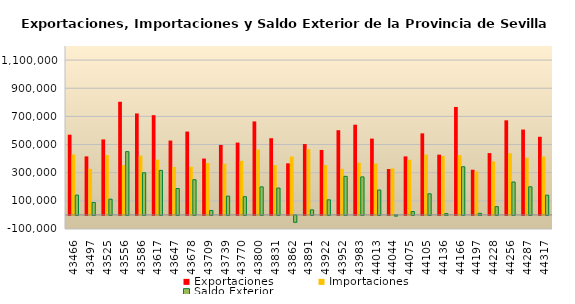
| Category | Exportaciones | Importaciones | Saldo Exterior |
|---|---|---|---|
| 2019-01-01 | 569931.277 | 429494.742 | 140436.534 |
| 2019-02-01 | 415835.783 | 327549.688 | 88286.094 |
| 2019-03-01 | 536289.213 | 424398.806 | 111890.407 |
| 2019-04-01 | 803799.832 | 354056.045 | 449743.787 |
| 2019-05-01 | 720786.65 | 421173.779 | 299612.871 |
| 2019-06-01 | 708636.402 | 392376.669 | 316259.734 |
| 2019-07-01 | 528188.273 | 340690.207 | 187498.067 |
| 2019-08-01 | 592019.511 | 341747.051 | 250272.46 |
| 2019-09-01 | 400434 | 368760 | 31674 |
| 2019-10-01 | 497188.203 | 363534.861 | 133653.342 |
| 2019-11-01 | 513902.151 | 384307.903 | 129594.248 |
| 2019-12-01 | 664224.395 | 464969.096 | 199255.3 |
| 2020-01-01 | 544870.53 | 354001.597 | 190868.934 |
| 2020-02-01 | 366257.686 | 415208.864 | -48951.178 |
| 2020-03-01 | 503457.961 | 467455.717 | 36002.244 |
| 2020-04-01 | 461491.765 | 354222.346 | 107269.419 |
| 2020-05-01 | 601776.553 | 327669.596 | 274106.957 |
| 2020-06-01 | 641019.697 | 370799.774 | 270219.922 |
| 2020-07-01 | 542062.842 | 365220.14 | 176842.702 |
| 2020-08-01 | 326019.875 | 330571.151 | -4551.276 |
| 2020-09-01 | 415851.902 | 391765.108 | 24086.795 |
| 2020-10-01 | 579330.618 | 429257.837 | 150072.781 |
| 2020-11-01 | 428116.983 | 418885.529 | 9231.454 |
| 2020-12-01 | 766984.753 | 424753.82 | 342230.933 |
| 2021-01-01 | 321034.509 | 309401.545 | 11632.963 |
| 2021-02-01 | 439118.252 | 380078.53 | 59039.722 |
| 2021-03-01 | 672033.912 | 438109.505 | 233924.407 |
| 2021-04-01 | 606425.006 | 406580.734 | 199844.272 |
| 2021-05-01 | 555191.585 | 414958.964 | 140232.621 |